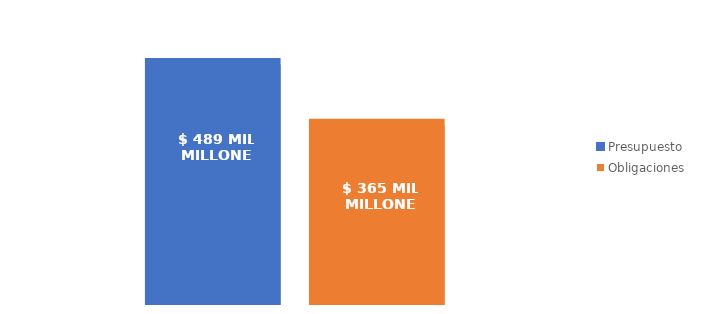
| Category | Presupuesto | Obligaciones |
|---|---|---|
| Total | 488877869435.524 | 364598930399.72 |